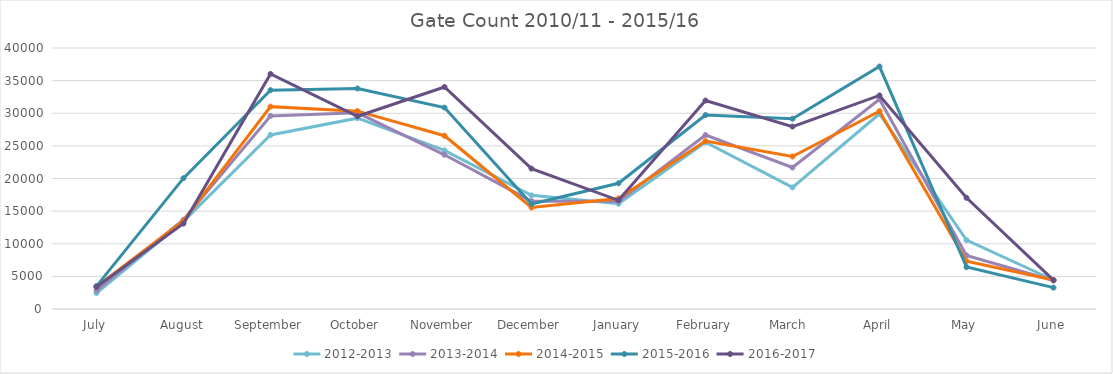
| Category | 2012-2013 | 2013-2014 | 2014-2015 | 2015-2016 | 2016-2017 |
|---|---|---|---|---|---|
| July | 2445 | 2853 | 3427 | 3506 | 3392 |
| August | 13422 | 13673 | 13530 | 20050 | 13096 |
| September | 26680 | 29591 | 31012 | 33538 | 36026 |
| October | 29248 | 30066 | 30320 | 33791 | 29537 |
| November | 24303 | 23633 | 26556 | 30869 | 34023 |
| December | 17415 | 16531 | 15551 | 16096 | 21512 |
| January | 16129 | 16495 | 16941 | 19271 | 16654 |
| February | 25554 | 26660 | 25731 | 29730 | 31949 |
| March  | 18638 | 21683 | 23376 | 29158 | 27959 |
| April | 29919 | 32147 | 30320 | 37159 | 32727 |
| May | 10547 | 8219 | 7321 | 6424 | 17041 |
| June | 4445 | 4361 | 4453 | 3273 | 4431 |